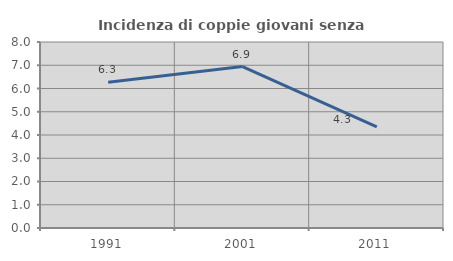
| Category | Incidenza di coppie giovani senza figli |
|---|---|
| 1991.0 | 6.269 |
| 2001.0 | 6.944 |
| 2011.0 | 4.348 |